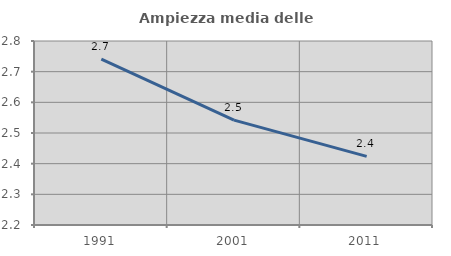
| Category | Ampiezza media delle famiglie |
|---|---|
| 1991.0 | 2.741 |
| 2001.0 | 2.542 |
| 2011.0 | 2.424 |